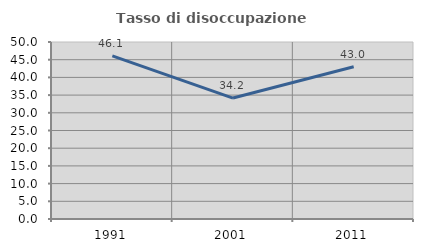
| Category | Tasso di disoccupazione giovanile  |
|---|---|
| 1991.0 | 46.096 |
| 2001.0 | 34.167 |
| 2011.0 | 42.988 |